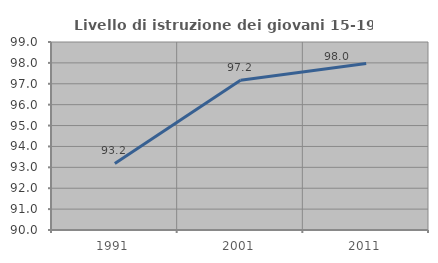
| Category | Livello di istruzione dei giovani 15-19 anni |
|---|---|
| 1991.0 | 93.187 |
| 2001.0 | 97.17 |
| 2011.0 | 97.973 |